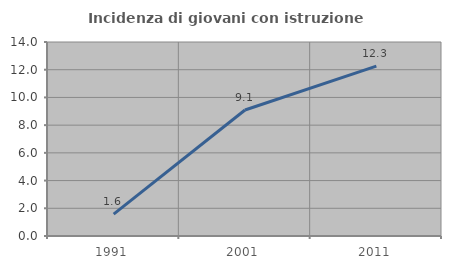
| Category | Incidenza di giovani con istruzione universitaria |
|---|---|
| 1991.0 | 1.575 |
| 2001.0 | 9.091 |
| 2011.0 | 12.255 |